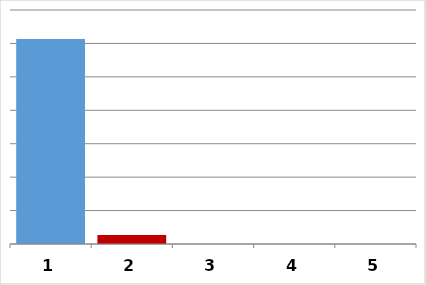
| Category | Series 0 |
|---|---|
| 0 | 6135891.02 |
| 1 | 270000 |
| 2 | 0 |
| 3 | 0 |
| 4 | 0 |